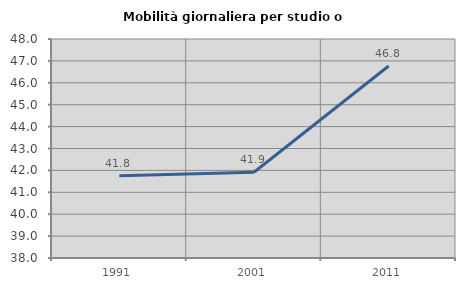
| Category | Mobilità giornaliera per studio o lavoro |
|---|---|
| 1991.0 | 41.757 |
| 2001.0 | 41.914 |
| 2011.0 | 46.767 |